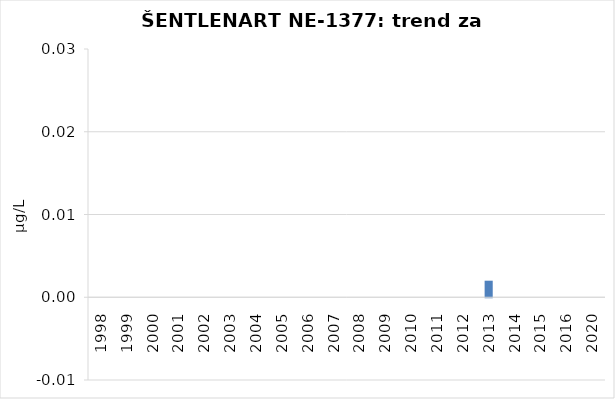
| Category | Vsota |
|---|---|
| 1998 | 0 |
| 1999 | 0 |
| 2000 | 0 |
| 2001 | 0 |
| 2002 | 0 |
| 2003 | 0 |
| 2004 | 0 |
| 2005 | 0 |
| 2006 | 0 |
| 2007 | 0 |
| 2008 | 0 |
| 2009 | 0 |
| 2010 | 0 |
| 2011 | 0 |
| 2012 | 0 |
| 2013 | 0.002 |
| 2014 | 0 |
| 2015 | 0 |
| 2016 | 0 |
| 2020 | 0 |